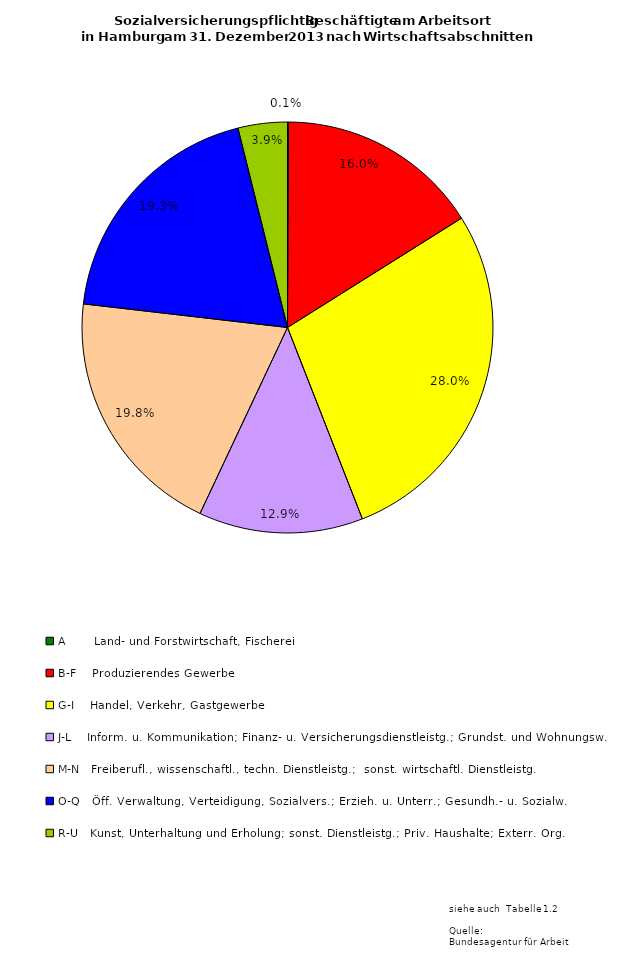
| Category | Series 0 | Series 1 | Series 2 |
|---|---|---|---|
| A       Land- und Forstwirtschaft, Fischerei | 662 | 216 | 446 |
| B-F    Produzierendes Gewerbe | 141965 | 30675 | 111290 |
| G-I    Handel, Verkehr, Gastgewerbe | 248410 | 104512 | 143898 |
| J-L    Inform. u. Kommunikation; Finanz- u. Versicherungsdienstleistg.; Grundst. und Wohnungsw. | 114775 | 51581 | 63194 |
| M-N   Freiberufl., wissenschaftl., techn. Dienstleistg.;  sonst. wirtschaftl. Dienstleistg.  | 176031 | 86199 | 89832 |
| O-Q   Öff. Verwaltung, Verteidigung, Sozialvers.; Erzieh. u. Unterr.; Gesundh.- u. Sozialw. | 171153 | 120509 | 50644 |
| R-U   Kunst, Unterhaltung und Erholung; sonst. Dienstleistg.; Priv. Haushalte; Exterr. Org. | 34423 | 20698 | 13725 |